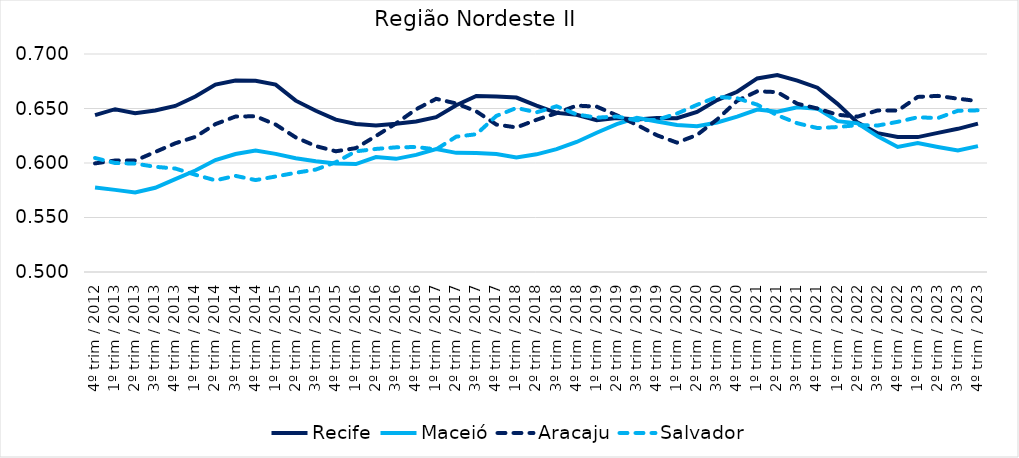
| Category | Recife | Maceió | Aracaju | Salvador |
|---|---|---|---|---|
| 4º trim / 2012 | 0.644 | 0.578 | 0.6 | 0.605 |
| 1º trim / 2013 | 0.649 | 0.575 | 0.602 | 0.6 |
| 2º trim / 2013 | 0.646 | 0.573 | 0.602 | 0.599 |
| 3º trim / 2013 | 0.648 | 0.577 | 0.61 | 0.597 |
| 4º trim / 2013 | 0.652 | 0.585 | 0.618 | 0.595 |
| 1º trim / 2014 | 0.661 | 0.593 | 0.624 | 0.589 |
| 2º trim / 2014 | 0.672 | 0.603 | 0.636 | 0.584 |
| 3º trim / 2014 | 0.676 | 0.608 | 0.643 | 0.588 |
| 4º trim / 2014 | 0.676 | 0.611 | 0.643 | 0.584 |
| 1º trim / 2015 | 0.672 | 0.608 | 0.635 | 0.588 |
| 2º trim / 2015 | 0.657 | 0.604 | 0.624 | 0.591 |
| 3º trim / 2015 | 0.648 | 0.602 | 0.616 | 0.594 |
| 4º trim / 2015 | 0.64 | 0.6 | 0.611 | 0.601 |
| 1º trim / 2016 | 0.636 | 0.599 | 0.614 | 0.611 |
| 2º trim / 2016 | 0.634 | 0.605 | 0.625 | 0.613 |
| 3º trim / 2016 | 0.636 | 0.604 | 0.636 | 0.614 |
| 4º trim / 2016 | 0.638 | 0.607 | 0.649 | 0.615 |
| 1º trim / 2017 | 0.642 | 0.613 | 0.659 | 0.612 |
| 2º trim / 2017 | 0.653 | 0.609 | 0.655 | 0.624 |
| 3º trim / 2017 | 0.662 | 0.609 | 0.647 | 0.626 |
| 4º trim / 2017 | 0.661 | 0.608 | 0.635 | 0.643 |
| 1º trim / 2018 | 0.66 | 0.605 | 0.633 | 0.651 |
| 2º trim / 2018 | 0.653 | 0.608 | 0.64 | 0.646 |
| 3º trim / 2018 | 0.646 | 0.613 | 0.646 | 0.652 |
| 4º trim / 2018 | 0.644 | 0.619 | 0.653 | 0.645 |
| 1º trim / 2019 | 0.639 | 0.628 | 0.652 | 0.642 |
| 2º trim / 2019 | 0.641 | 0.636 | 0.644 | 0.643 |
| 3º trim / 2019 | 0.64 | 0.641 | 0.635 | 0.639 |
| 4º trim / 2019 | 0.641 | 0.638 | 0.625 | 0.64 |
| 1º trim / 2020 | 0.641 | 0.635 | 0.619 | 0.645 |
| 2º trim / 2020 | 0.647 | 0.634 | 0.626 | 0.653 |
| 3º trim / 2020 | 0.658 | 0.637 | 0.64 | 0.661 |
| 4º trim / 2020 | 0.665 | 0.642 | 0.657 | 0.659 |
| 1º trim / 2021 | 0.678 | 0.649 | 0.666 | 0.654 |
| 2º trim / 2021 | 0.681 | 0.647 | 0.665 | 0.644 |
| 3º trim / 2021 | 0.676 | 0.651 | 0.654 | 0.636 |
| 4º trim / 2021 | 0.669 | 0.65 | 0.65 | 0.632 |
| 1º trim / 2022 | 0.654 | 0.638 | 0.644 | 0.633 |
| 2º trim / 2022 | 0.637 | 0.636 | 0.643 | 0.635 |
| 3º trim / 2022 | 0.627 | 0.624 | 0.648 | 0.634 |
| 4º trim / 2022 | 0.624 | 0.615 | 0.648 | 0.638 |
| 1º trim / 2023 | 0.624 | 0.618 | 0.661 | 0.642 |
| 2º trim / 2023 | 0.628 | 0.615 | 0.662 | 0.641 |
| 3º trim / 2023 | 0.631 | 0.611 | 0.659 | 0.648 |
| 4º trim / 2023 | 0.636 | 0.615 | 0.657 | 0.648 |